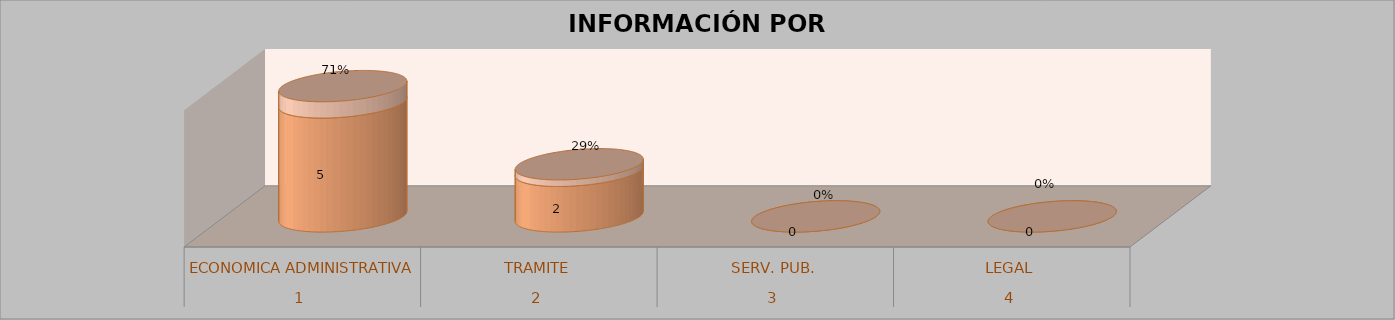
| Category | Series 0 | Series 1 | Series 2 | Series 3 |
|---|---|---|---|---|
| 0 |  |  | 5 | 0.714 |
| 1 |  |  | 2 | 0.286 |
| 2 |  |  | 0 | 0 |
| 3 |  |  | 0 | 0 |